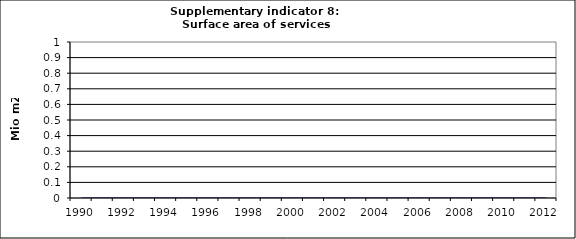
| Category | Surface area of services buildings, Mio m2 |
|---|---|
| 1990 | 0 |
| 1991 | 0 |
| 1992 | 0 |
| 1993 | 0 |
| 1994 | 0 |
| 1995 | 0 |
| 1996 | 0 |
| 1997 | 0 |
| 1998 | 0 |
| 1999 | 0 |
| 2000 | 0 |
| 2001 | 0 |
| 2002 | 0 |
| 2003 | 0 |
| 2004 | 0 |
| 2005 | 0 |
| 2006 | 0 |
| 2007 | 0 |
| 2008 | 0 |
| 2009 | 0 |
| 2010 | 0 |
| 2011 | 0 |
| 2012 | 0 |